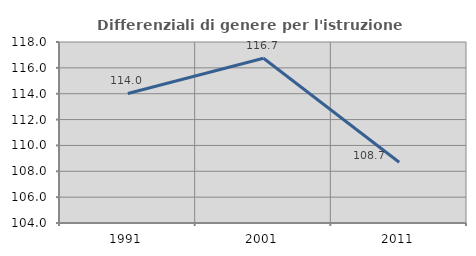
| Category | Differenziali di genere per l'istruzione superiore |
|---|---|
| 1991.0 | 114.017 |
| 2001.0 | 116.743 |
| 2011.0 | 108.695 |